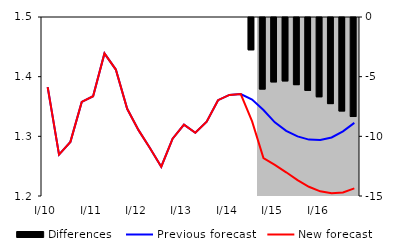
| Category | Differences |
|---|---|
| 0 | 0 |
| 1 | 0 |
| 2 | 0 |
| 3 | 0 |
| 4 | 0 |
| 5 | 0 |
| 6 | 0 |
| 7 | 0 |
| 8 | 0 |
| 9 | 0 |
| 10 | 0 |
| 11 | 0 |
| 12 | 0 |
| 13 | 0 |
| 14 | 0 |
| 15 | 0 |
| 16 | 0 |
| 17 | 0 |
| 18 | -2.706 |
| 19 | -5.995 |
| 20 | -5.395 |
| 21 | -5.313 |
| 22 | -5.627 |
| 23 | -6.106 |
| 24 | -6.641 |
| 25 | -7.215 |
| 26 | -7.832 |
| 27 | -8.297 |